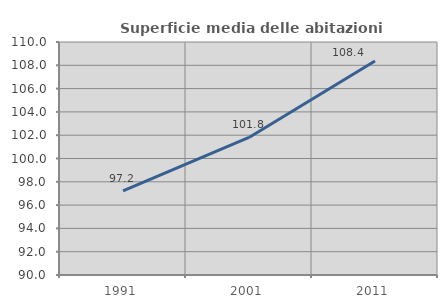
| Category | Superficie media delle abitazioni occupate |
|---|---|
| 1991.0 | 97.231 |
| 2001.0 | 101.81 |
| 2011.0 | 108.377 |